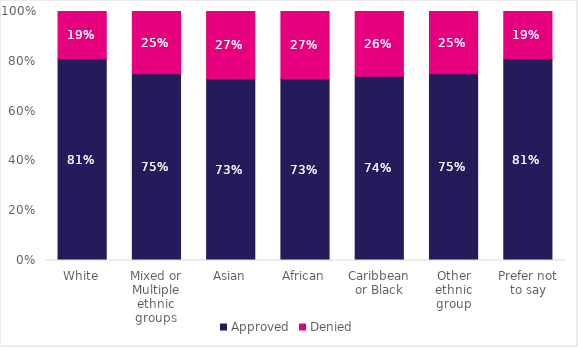
| Category | Approved | Denied |
|---|---|---|
| White | 0.81 | 0.19 |
| Mixed or Multiple ethnic groups | 0.75 | 0.25 |
| Asian | 0.73 | 0.27 |
| African | 0.73 | 0.27 |
| Caribbean or Black | 0.74 | 0.26 |
| Other ethnic group | 0.75 | 0.25 |
| Prefer not to say | 0.81 | 0.19 |